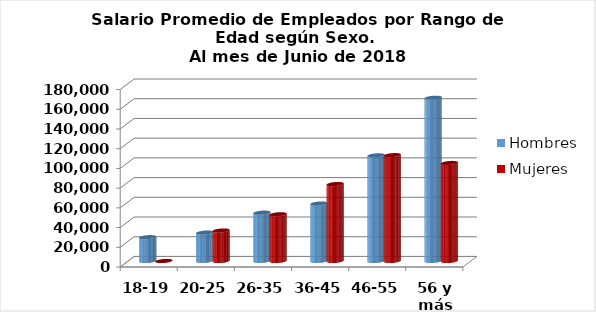
| Category | Hombres | Mujeres |
|---|---|---|
| 18-19 | 24156 | 0 |
| 20-25 | 28834.364 | 30900.778 |
| 26-35 | 49020.389 | 47387.283 |
| 36-45 | 58254.454 | 78031.575 |
| 46-55 | 107156.658 | 107358.955 |
| 56 y más | 165597.287 | 99431.533 |